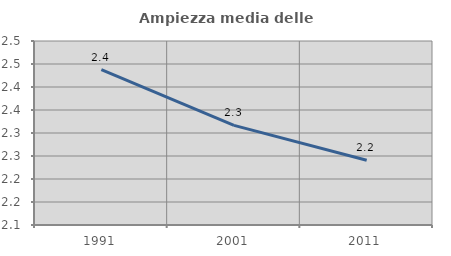
| Category | Ampiezza media delle famiglie |
|---|---|
| 1991.0 | 2.438 |
| 2001.0 | 2.317 |
| 2011.0 | 2.241 |